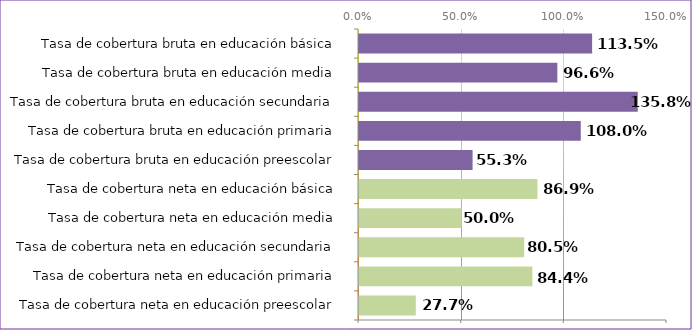
| Category | Series 0 |
|---|---|
| Tasa de cobertura neta en educación preescolar | 0.277 |
| Tasa de cobertura neta en educación primaria | 0.844 |
| Tasa de cobertura neta en educación secundaria | 0.804 |
| Tasa de cobertura neta en educación media | 0.5 |
| Tasa de cobertura neta en educación básica | 0.869 |
| Tasa de cobertura bruta en educación preescolar | 0.553 |
| Tasa de cobertura bruta en educación primaria | 1.08 |
| Tasa de cobertura bruta en educación secundaria | 1.358 |
| Tasa de cobertura bruta en educación media | 0.966 |
| Tasa de cobertura bruta en educación básica | 1.135 |